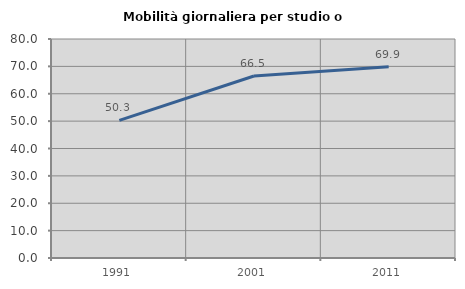
| Category | Mobilità giornaliera per studio o lavoro |
|---|---|
| 1991.0 | 50.286 |
| 2001.0 | 66.471 |
| 2011.0 | 69.886 |